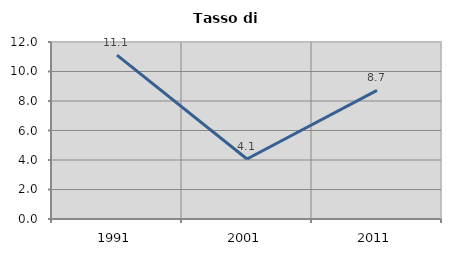
| Category | Tasso di disoccupazione   |
|---|---|
| 1991.0 | 11.111 |
| 2001.0 | 4.07 |
| 2011.0 | 8.725 |